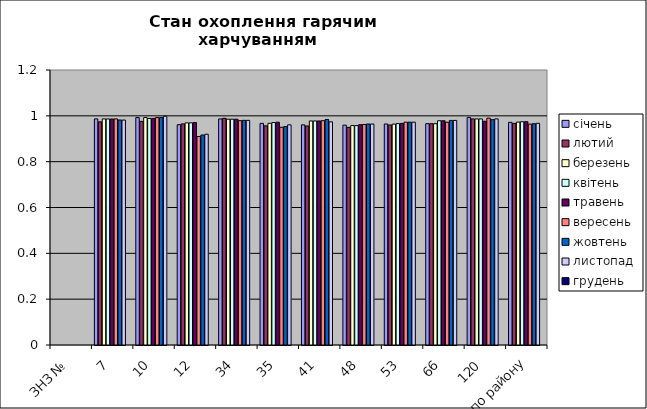
| Category | січень | лютий | березень | квітень | травень | вересень | жовтень | листопад | грудень |
|---|---|---|---|---|---|---|---|---|---|
| ЗНЗ № | 0 | 0 | 0 | 0 | 0 | 0 | 0 | 0 | 0 |
| 7 | 0.987 | 0.974 | 0.986 | 0.986 | 0.986 | 0.987 | 0.982 | 0.982 | 0 |
| 10 | 0.992 | 0.976 | 0.992 | 0.989 | 0.989 | 0.992 | 0.992 | 0.998 | 0 |
| 12 | 0.961 | 0.965 | 0.969 | 0.969 | 0.97 | 0.91 | 0.916 | 0.92 | 0 |
| 34 | 0.986 | 0.989 | 0.985 | 0.985 | 0.985 | 0.979 | 0.98 | 0.98 | 0 |
| 35 | 0.967 | 0.956 | 0.967 | 0.971 | 0.972 | 0.95 | 0.953 | 0.961 | 0 |
| 41 | 0.961 | 0.956 | 0.978 | 0.978 | 0.978 | 0.979 | 0.984 | 0.974 | 0 |
| 48 | 0.959 | 0.95 | 0.958 | 0.957 | 0.961 | 0.962 | 0.964 | 0.964 | 0 |
| 53 | 0.964 | 0.96 | 0.964 | 0.966 | 0.967 | 0.972 | 0.972 | 0.972 | 0 |
| 66 | 0.966 | 0.966 | 0.966 | 0.978 | 0.978 | 0.972 | 0.98 | 0.98 | 0 |
| 120 | 0.993 | 0.987 | 0.986 | 0.986 | 0.976 | 0.99 | 0.983 | 0.987 | 0 |
| по району | 0.972 | 0.967 | 0.973 | 0.974 | 0.974 | 0.964 | 0.966 | 0.967 | 0 |